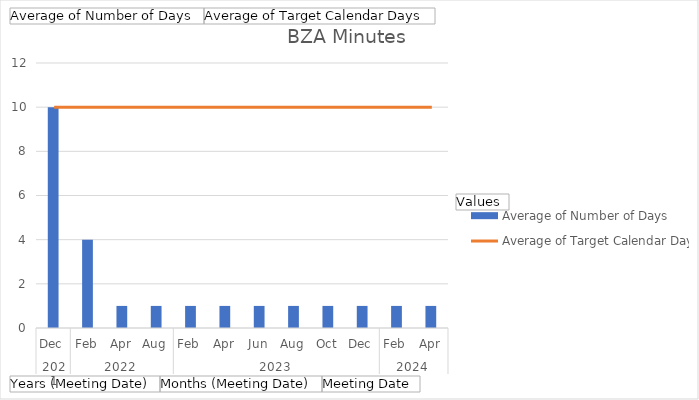
| Category | Average of Number of Days |
|---|---|
| 0 | 10 |
| 1 | 4 |
| 2 | 1 |
| 3 | 1 |
| 4 | 1 |
| 5 | 1 |
| 6 | 1 |
| 7 | 1 |
| 8 | 1 |
| 9 | 1 |
| 10 | 1 |
| 11 | 1 |